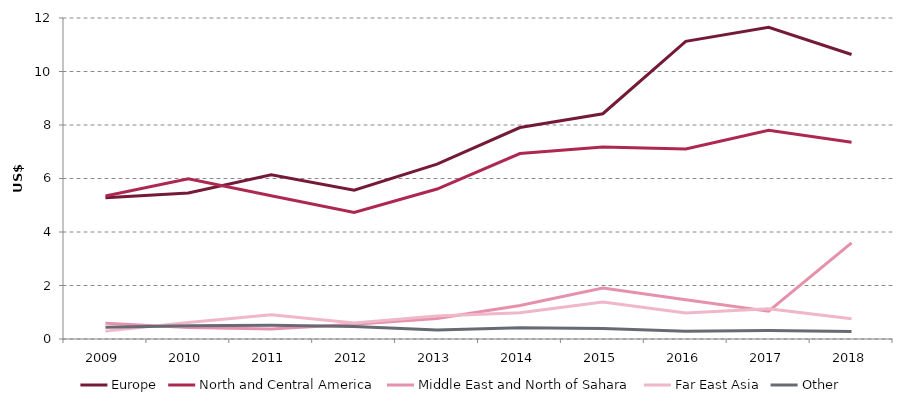
| Category | Europe | North and Central America | Middle East and North of Sahara | Far East Asia | Other |
|---|---|---|---|---|---|
| 2009.0 | 5.277 | 5.346 | 0.586 | 0.294 | 0.435 |
| 2010.0 | 5.458 | 5.989 | 0.425 | 0.613 | 0.493 |
| 2011.0 | 6.141 | 5.357 | 0.378 | 0.903 | 0.511 |
| 2012.0 | 5.563 | 4.727 | 0.551 | 0.6 | 0.47 |
| 2013.0 | 6.535 | 5.607 | 0.767 | 0.86 | 0.341 |
| 2014.0 | 7.906 | 6.934 | 1.252 | 0.982 | 0.417 |
| 2015.0 | 8.421 | 7.181 | 1.901 | 1.386 | 0.389 |
| 2016.0 | 11.128 | 7.101 | 1.466 | 0.969 | 0.285 |
| 2017.0 | 11.655 | 7.804 | 1.036 | 1.131 | 0.314 |
| 2018.0 | 10.634 | 7.359 | 3.596 | 0.76 | 0.283 |